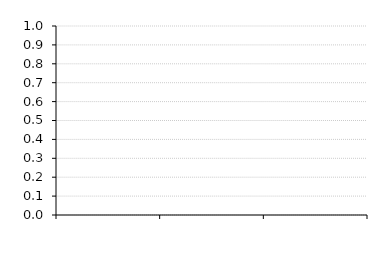
| Category | Quick Ratio |
|---|---|
| 0 | 0 |
| 1 | 0 |
| 2 | 0 |